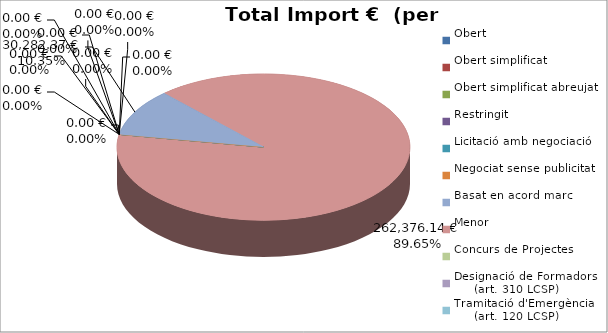
| Category | Total preu
(amb IVA) |
|---|---|
| Obert | 0 |
| Obert simplificat | 0 |
| Obert simplificat abreujat | 0 |
| Restringit | 0 |
| Licitació amb negociació | 0 |
| Negociat sense publicitat | 0 |
| Basat en acord marc | 30282.37 |
| Menor | 262376.14 |
| Concurs de Projectes | 0 |
| Designació de Formadors
     (art. 310 LCSP) | 0 |
| Tramitació d'Emergència
     (art. 120 LCSP) | 0 |